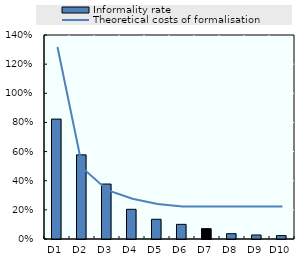
| Category | Informality rate |
|---|---|
| D1 | 0.823 |
| D2 | 0.578 |
| D3 | 0.377 |
| D4 | 0.204 |
| D5 | 0.135 |
| D6 | 0.101 |
| D7 | 0.071 |
| D8 | 0.037 |
| D9 | 0.028 |
| D10 | 0.023 |